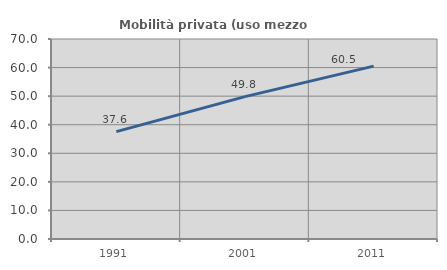
| Category | Mobilità privata (uso mezzo privato) |
|---|---|
| 1991.0 | 37.577 |
| 2001.0 | 49.837 |
| 2011.0 | 60.503 |